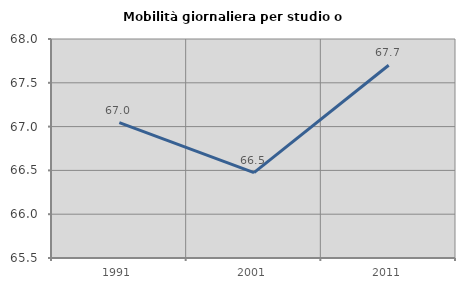
| Category | Mobilità giornaliera per studio o lavoro |
|---|---|
| 1991.0 | 67.046 |
| 2001.0 | 66.474 |
| 2011.0 | 67.7 |